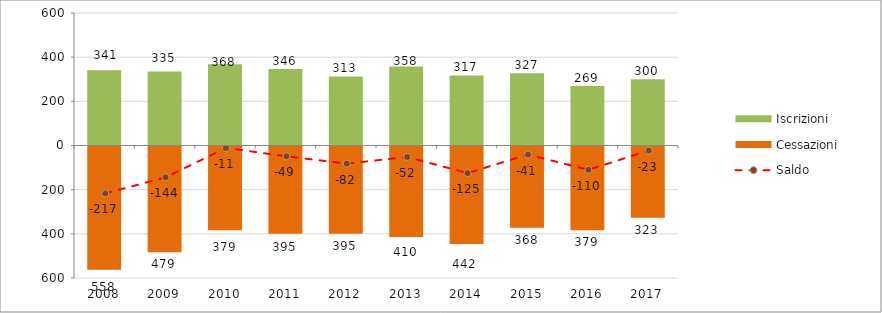
| Category | Iscrizioni | Cessazioni |
|---|---|---|
| 2008.0 | 341 | -558 |
| 2009.0 | 335 | -479 |
| 2010.0 | 368 | -379 |
| 2011.0 | 346 | -395 |
| 2012.0 | 313 | -395 |
| 2013.0 | 358 | -410 |
| 2014.0 | 317 | -442 |
| 2015.0 | 327 | -368 |
| 2016.0 | 269 | -379 |
| 2017.0 | 300 | -323 |